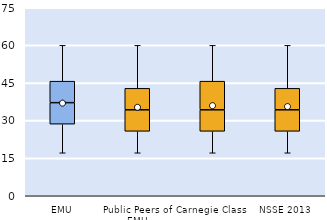
| Category | 25th | 50th | 75th |
|---|---|---|---|
| EMU | 28.571 | 8.571 | 8.571 |
| Public Peers of EMU | 25.714 | 8.571 | 8.571 |
| Carnegie Class | 25.714 | 8.571 | 11.429 |
| NSSE 2013 | 25.714 | 8.571 | 8.571 |